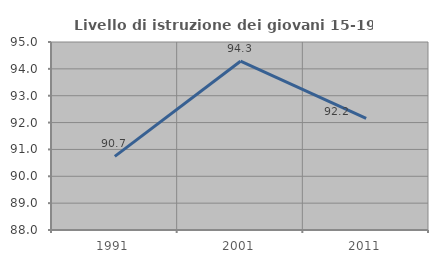
| Category | Livello di istruzione dei giovani 15-19 anni |
|---|---|
| 1991.0 | 90.741 |
| 2001.0 | 94.286 |
| 2011.0 | 92.157 |